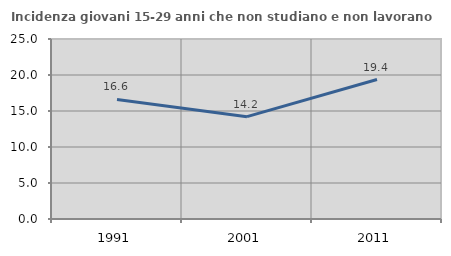
| Category | Incidenza giovani 15-29 anni che non studiano e non lavorano  |
|---|---|
| 1991.0 | 16.601 |
| 2001.0 | 14.212 |
| 2011.0 | 19.373 |